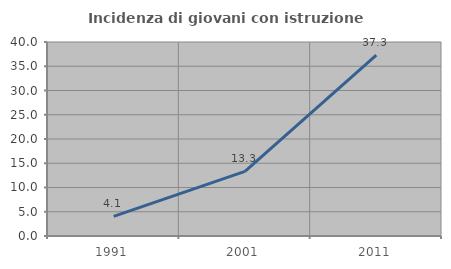
| Category | Incidenza di giovani con istruzione universitaria |
|---|---|
| 1991.0 | 4.054 |
| 2001.0 | 13.333 |
| 2011.0 | 37.288 |